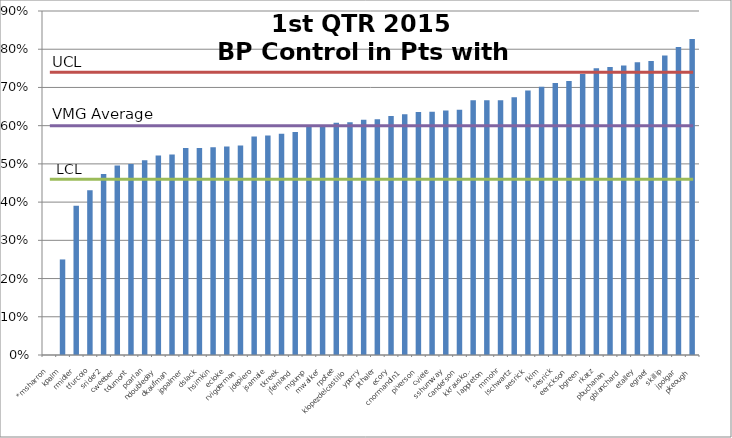
| Category | Series 0 |
|---|---|
| *msharron | 0 |
| kpalm | 0.25 |
| rmidler | 0.39 |
| tfurcolo | 0.431 |
| srider2 | 0.474 |
| cweeber | 0.496 |
| tdumont | 0.5 |
| pcarlan | 0.509 |
| ndoubleday | 0.522 |
| dkaufman | 0.524 |
| jppalmer | 0.541 |
| dslack | 0.542 |
| hsimkin | 0.543 |
| ecloke | 0.545 |
| rvigderman | 0.548 |
| jdepiero | 0.571 |
| jsamale | 0.574 |
| tkreek | 0.579 |
| jfeinland | 0.583 |
| mgump | 0.6 |
| mwalker | 0.6 |
| rpotee | 0.608 |
| klopezdelcastillo | 0.609 |
| yperry | 0.615 |
| pthaler | 0.617 |
| ecory | 0.625 |
| cnormandin1 | 0.63 |
| piverson | 0.636 |
| cviele | 0.636 |
| sshumway | 0.64 |
| canderson | 0.642 |
| kkrauskopf | 0.667 |
| lappleton | 0.667 |
| mmohr | 0.667 |
| lschwartz | 0.674 |
| aesrick | 0.692 |
| fkim | 0.701 |
| sesrick | 0.712 |
| eerickson | 0.717 |
| bgreen | 0.735 |
| rkatz | 0.75 |
| pbuchanan | 0.753 |
| gblanchard | 0.758 |
| etalley | 0.766 |
| egraef | 0.769 |
| skillip | 0.783 |
| jpolgar | 0.806 |
| pkeough | 0.827 |